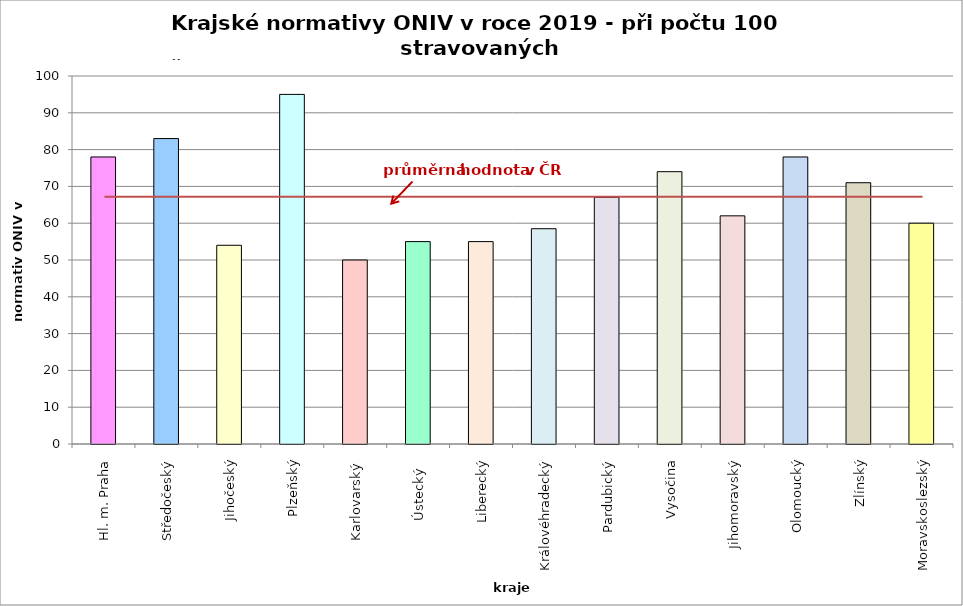
| Category | Series 0 |
|---|---|
| Hl. m. Praha | 78 |
| Středočeský | 83 |
| Jihočeský | 54 |
| Plzeňský | 95 |
| Karlovarský  | 50 |
| Ústecký   | 55 |
| Liberecký | 55 |
| Královéhradecký | 58.5 |
| Pardubický | 67 |
| Vysočina | 74 |
| Jihomoravský | 62 |
| Olomoucký | 78 |
| Zlínský | 71 |
| Moravskoslezský | 60 |